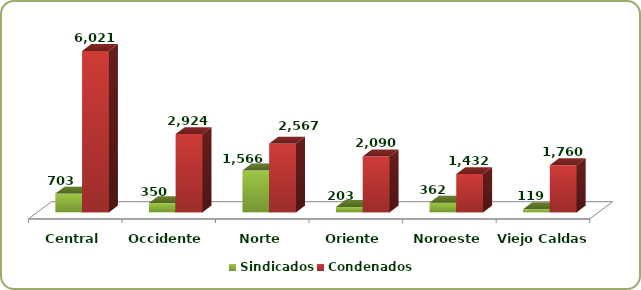
| Category | Sindicados | Condenados |
|---|---|---|
| Central | 703 | 6021 |
| Occidente | 350 | 2924 |
| Norte | 1566 | 2567 |
| Oriente | 203 | 2090 |
| Noroeste | 362 | 1432 |
| Viejo Caldas | 119 | 1760 |